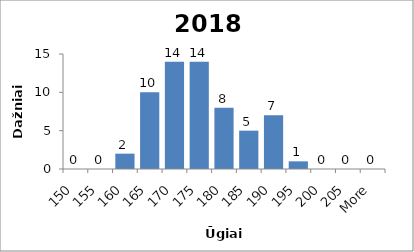
| Category | Frequency |
|---|---|
| 150 | 0 |
| 155 | 0 |
| 160 | 2 |
| 165 | 10 |
| 170 | 14 |
| 175 | 14 |
| 180 | 8 |
| 185 | 5 |
| 190 | 7 |
| 195 | 1 |
| 200 | 0 |
| 205 | 0 |
| More | 0 |